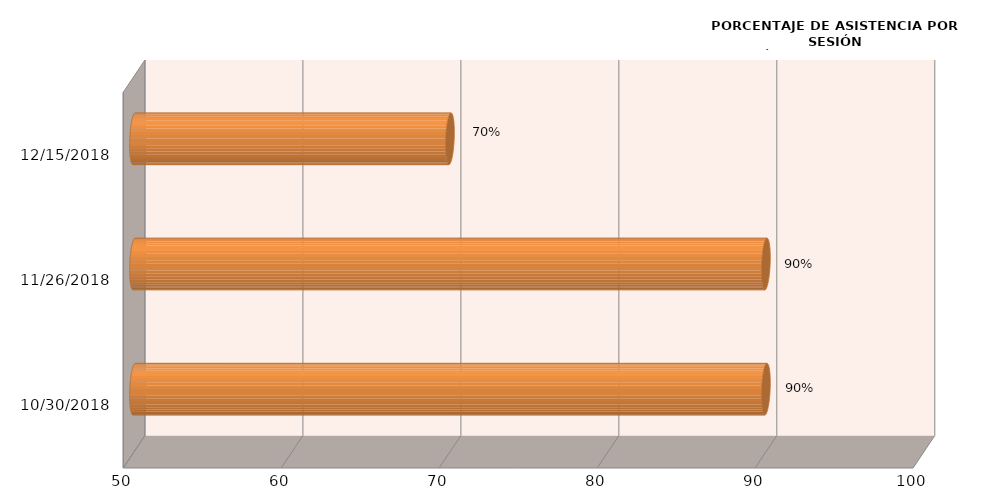
| Category | Series 0 |
|---|---|
| 30/10/2018 | 90 |
| 26/11/2018 | 90 |
| 15/12/2018 | 70 |